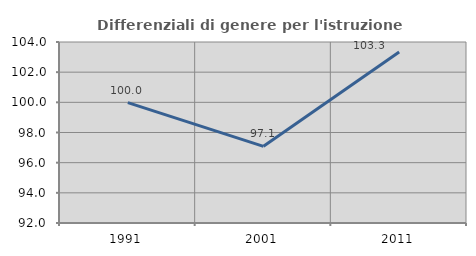
| Category | Differenziali di genere per l'istruzione superiore |
|---|---|
| 1991.0 | 99.982 |
| 2001.0 | 97.083 |
| 2011.0 | 103.332 |